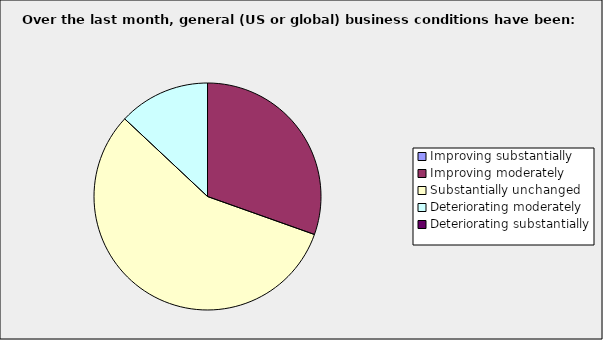
| Category | Series 0 |
|---|---|
| Improving substantially | 0 |
| Improving moderately | 0.304 |
| Substantially unchanged | 0.565 |
| Deteriorating moderately | 0.13 |
| Deteriorating substantially | 0 |